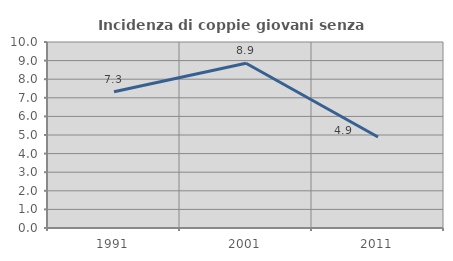
| Category | Incidenza di coppie giovani senza figli |
|---|---|
| 1991.0 | 7.33 |
| 2001.0 | 8.861 |
| 2011.0 | 4.89 |